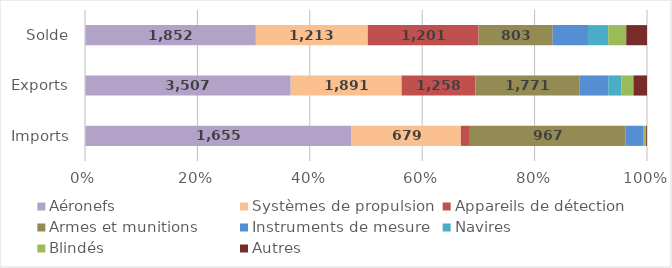
| Category | Aéronefs | Systèmes de propulsion | Appareils de détection | Armes et munitions | Instruments de mesure | Navires | Blindés | Autres |
|---|---|---|---|---|---|---|---|---|
| Imports | 1655 | 679 | 56 | 967 | 112 | 2 | 14 | 5 |
| Exports | 3507 | 1891 | 1258 | 1771 | 494 | 221 | 209 | 231 |
| Solde | 1852 | 1213 | 1201 | 803 | 383 | 219 | 195 | 225 |